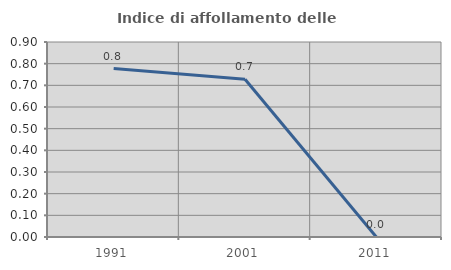
| Category | Indice di affollamento delle abitazioni  |
|---|---|
| 1991.0 | 0.777 |
| 2001.0 | 0.728 |
| 2011.0 | 0 |